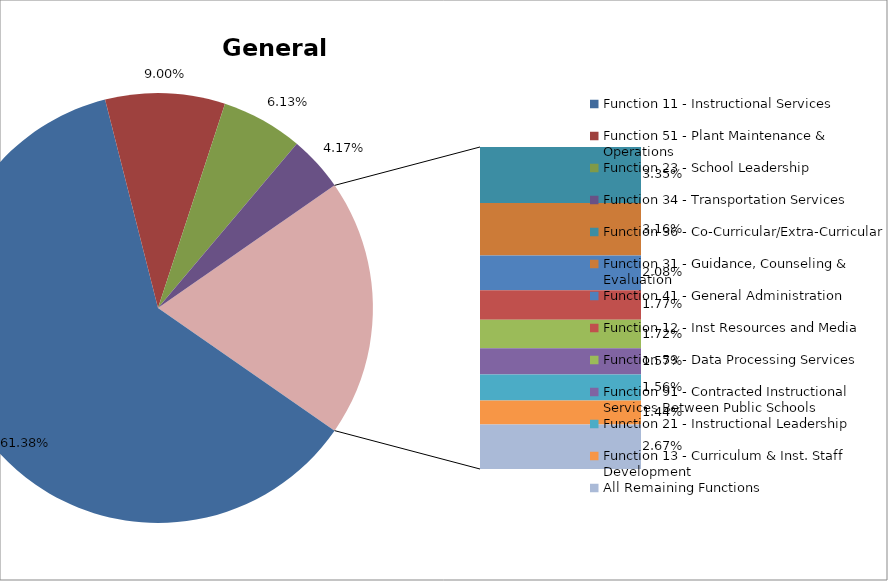
| Category | Series 0 |
|---|---|
| Function 11 - Instructional Services | 0.614 |
| Function 51 - Plant Maintenance & Operations | 0.09 |
| Function 23 - School Leadership | 0.061 |
| Function 34 - Transportation Services | 0.042 |
| Function 36 - Co-Curricular/Extra-Curricular | 0.034 |
| Function 31 - Guidance, Counseling & Evaluation | 0.032 |
| Function 41 - General Administration | 0.021 |
| Function 12 - Inst Resources and Media | 0.018 |
| Function 53 - Data Processing Services | 0.017 |
| Function 91 - Contracted Instructional Services Between Public Schools | 0.016 |
| Function 21 - Instructional Leadership | 0.016 |
| Function 13 - Curriculum & Inst. Staff Development | 0.014 |
| All Remaining Functions | 0.027 |